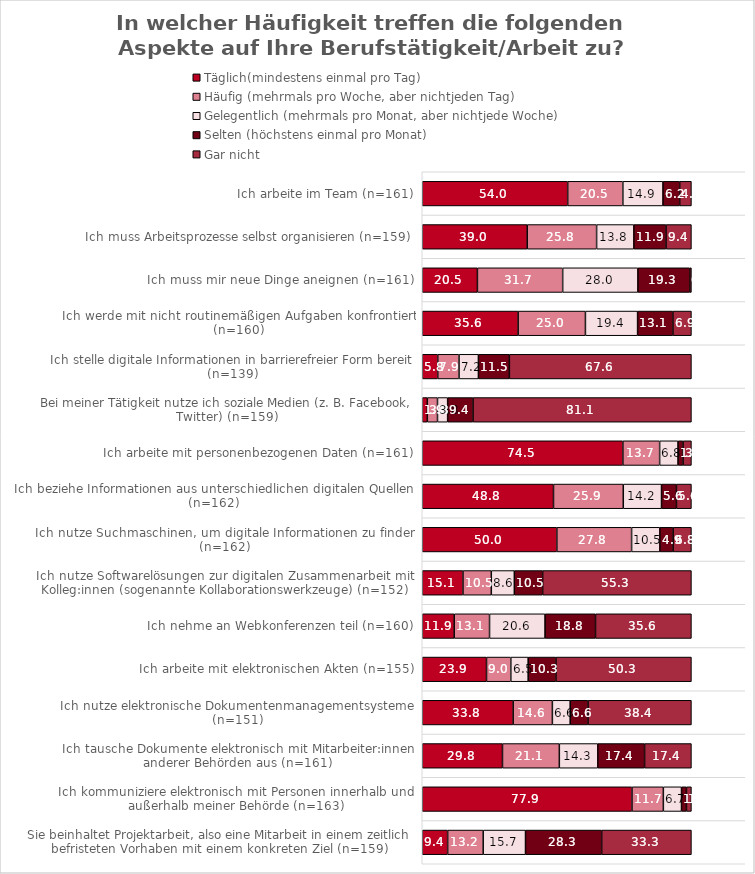
| Category | Täglich(mindestens einmal pro Tag) | Häufig (mehrmals pro Woche, aber nichtjeden Tag) | Gelegentlich (mehrmals pro Monat, aber nichtjede Woche) | Selten (höchstens einmal pro Monat) | Gar nicht |
|---|---|---|---|---|---|
| Sie beinhaltet Projektarbeit, also eine Mitarbeit in einem zeitlich befristeten Vorhaben mit einem konkreten Ziel (n=159) | 9.434 | 13.208 | 15.723 | 28.302 | 33.333 |
| Ich kommuniziere elektronisch mit Personen innerhalb und außerhalb meiner Behörde (n=163) | 77.914 | 11.656 | 6.748 | 1.84 | 1.84 |
| Ich tausche Dokumente elektronisch mit Mitarbeiter:innen anderer Behörden aus (n=161) | 29.814 | 21.118 | 14.286 | 17.391 | 17.391 |
| Ich nutze elektronische Dokumentenmanagementsysteme (n=151) | 33.775 | 14.57 | 6.623 | 6.623 | 38.411 |
| Ich arbeite mit elektronischen Akten (n=155) | 23.871 | 9.032 | 6.452 | 10.323 | 50.323 |
| Ich nehme an Webkonferenzen teil (n=160) | 11.875 | 13.125 | 20.625 | 18.75 | 35.625 |
| Ich nutze Softwarelösungen zur digitalen Zusammenarbeit mit Kolleg:innen (sogenannte Kollaborationswerkzeuge) (n=152) | 15.132 | 10.526 | 8.553 | 10.526 | 55.263 |
| Ich nutze Suchmaschinen, um digitale Informationen zu finden (n=162) | 50 | 27.778 | 10.494 | 4.938 | 6.79 |
| Ich beziehe Informationen aus unterschiedlichen digitalen Quellen (n=162) | 48.765 | 25.926 | 14.198 | 5.556 | 5.556 |
| Ich arbeite mit personenbezogenen Daten (n=161) | 74.534 | 13.665 | 6.832 | 1.863 | 3.106 |
| Bei meiner Tätigkeit nutze ich soziale Medien (z. B. Facebook, Twitter) (n=159) | 1.887 | 3.774 | 3.774 | 9.434 | 81.132 |
| Ich stelle digitale Informationen in barrierefreier Form bereit (n=139) | 5.755 | 7.914 | 7.194 | 11.511 | 67.626 |
| Ich werde mit nicht routinemäßigen Aufgaben konfrontiert (n=160) | 35.625 | 25 | 19.375 | 13.125 | 6.875 |
| Ich muss mir neue Dinge aneignen (n=161) | 20.497 | 31.677 | 27.95 | 19.255 | 0.621 |
| Ich muss Arbeitsprozesse selbst organisieren (n=159) | 38.994 | 25.786 | 13.836 | 11.95 | 9.434 |
| Ich arbeite im Team (n=161) | 54.037 | 20.497 | 14.907 | 6.211 | 4.348 |